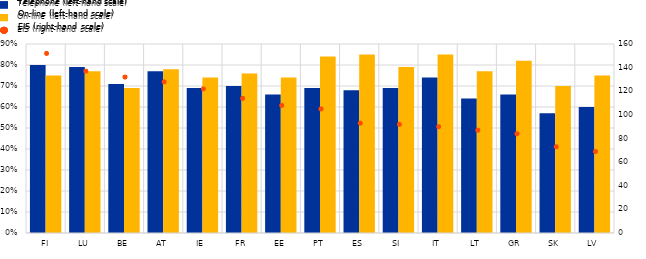
| Category | Telephone (left-hand scale) | On-line (left-hand scale) |
|---|---|---|
| FI | 0.8 | 0.75 |
| LU | 0.79 | 0.77 |
| BE | 0.71 | 0.69 |
| AT | 0.77 | 0.78 |
| IE | 0.69 | 0.74 |
| FR | 0.7 | 0.76 |
| EE | 0.66 | 0.74 |
| PT | 0.69 | 0.84 |
| ES | 0.68 | 0.85 |
| SI | 0.69 | 0.79 |
| IT | 0.74 | 0.85 |
| LT | 0.64 | 0.77 |
| GR | 0.66 | 0.82 |
| SK | 0.57 | 0.7 |
| LV | 0.6 | 0.75 |